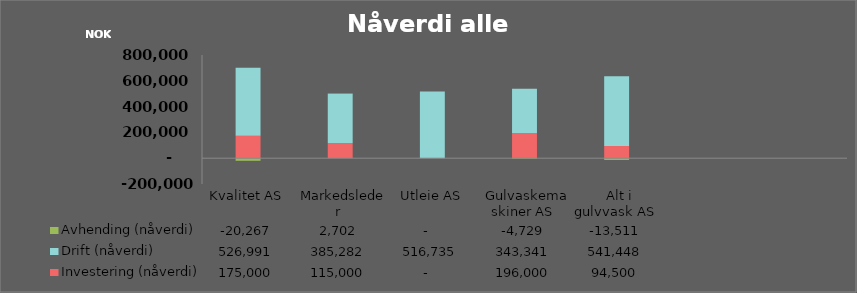
| Category | Investering (nåverdi) | Drift (nåverdi) | Avhending (nåverdi) |
|---|---|---|---|
|  Kvalitet AS  | 175000 | 526990.854 | -20266.925 |
|  Markedsleder  | 115000 | 385281.825 | 2702.257 |
|  Utleie AS  | 0 | 516735.437 | 0 |
|  Gulvaskemaskiner AS  | 196000 | 343340.707 | -4728.949 |
|  Alt i gulvvask AS  | 94500 | 541447.714 | -13511.283 |